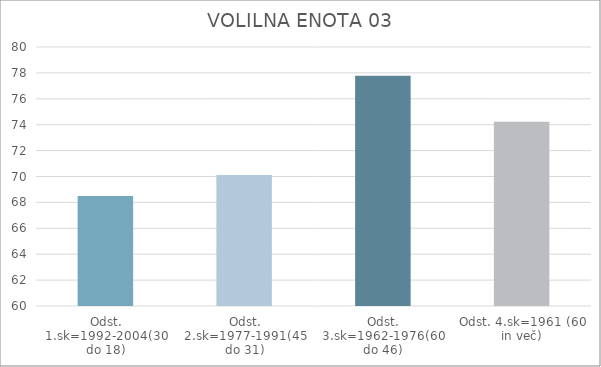
| Category | Series 0 |
|---|---|
| Odst. 1.sk=1992-2004(30 do 18) | 68.5 |
| Odst. 2.sk=1977-1991(45 do 31) | 70.12 |
| Odst. 3.sk=1962-1976(60 do 46) | 77.78 |
| Odst. 4.sk=1961 (60 in več) | 74.22 |